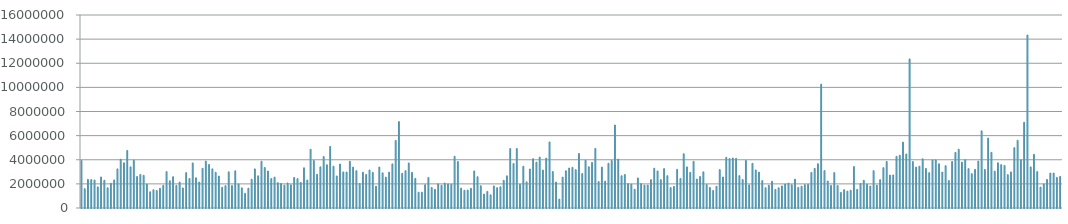
| Category | Series 0 |
|---|---|
| 0 | 3946390 |
| 01/01/1900 | 1602753 |
| 01/02/1900 | 2372721 |
| 01/03/1900 | 2360665 |
| 01/04/1900 | 2323856 |
| 01/05/1900 | 1751130 |
| 01/06/1900 | 2575121 |
| 01/07/1900 | 2301383 |
| 01/08/1900 | 1680497 |
| 01/09/1900 | 2054930 |
| 01/10/1900 | 2327089 |
| 01/11/1900 | 3243315 |
| 01/12/1900 | 4046918 |
| 01/13/1900 | 3746112 |
| 01/14/1900 | 4773891 |
| 01/15/1900 | 3409331 |
| 01/16/1900 | 3963879 |
| 01/17/1900 | 2609657 |
| 01/18/1900 | 2777923 |
| 01/19/1900 | 2710483 |
| 01/20/1900 | 1981261 |
| 01/21/1900 | 1346223 |
| 01/22/1900 | 1518529 |
| 01/23/1900 | 1452392 |
| 01/24/1900 | 1635826 |
| 01/25/1900 | 1880829 |
| 01/26/1900 | 3018823 |
| 01/27/1900 | 2259015 |
| 01/28/1900 | 2593445 |
| 01/29/1900 | 1875049 |
| 01/30/1900 | 2145251 |
| 01/31/1900 | 1665541 |
| 02/01/1900 | 2929063 |
| 02/02/1900 | 2443271 |
| 02/03/1900 | 3735485 |
| 02/04/1900 | 2502356 |
| 02/05/1900 | 2152778 |
| 02/06/1900 | 3288441 |
| 02/07/1900 | 3891859 |
| 02/08/1900 | 3602655 |
| 02/09/1900 | 3246615 |
| 02/10/1900 | 2961129 |
| 02/11/1900 | 2651836 |
| 02/12/1900 | 1719192 |
| 02/13/1900 | 1852563 |
| 02/14/1900 | 2996070 |
| 02/15/1900 | 1856852 |
| 02/16/1900 | 3083887 |
| 02/17/1900 | 1993288 |
| 02/18/1900 | 1673530 |
| 02/19/1900 | 1217043 |
| 02/20/1900 | 1644556 |
| 02/21/1900 | 2386463 |
| 02/22/1900 | 3242017 |
| 02/23/1900 | 2667200 |
| 02/24/1900 | 3876495 |
| 02/25/1900 | 3361025 |
| 02/26/1900 | 3067275 |
| 02/27/1900 | 2445652 |
| 02/28/1900 | 2561247 |
| 02/28/1900 | 2099490 |
| 03/01/1900 | 2030398 |
| 03/02/1900 | 1890686 |
| 03/03/1900 | 2076526 |
| 03/04/1900 | 1922738 |
| 03/05/1900 | 2536089 |
| 03/06/1900 | 2433474 |
| 03/07/1900 | 2120709 |
| 03/08/1900 | 3332353 |
| 03/09/1900 | 2321124 |
| 03/10/1900 | 4871186 |
| 03/11/1900 | 3933178 |
| 03/12/1900 | 2791394 |
| 03/13/1900 | 3413762 |
| 03/14/1900 | 4264014 |
| 03/15/1900 | 3584536 |
| 03/16/1900 | 5102383 |
| 03/17/1900 | 3465894 |
| 03/18/1900 | 2656096 |
| 03/19/1900 | 3646305 |
| 03/20/1900 | 2992025 |
| 03/21/1900 | 2981630 |
| 03/22/1900 | 3869230 |
| 03/23/1900 | 3392352 |
| 03/24/1900 | 3092191 |
| 03/25/1900 | 2026310 |
| 03/26/1900 | 2973783 |
| 03/27/1900 | 2784472 |
| 03/28/1900 | 3150487 |
| 03/29/1900 | 2962911 |
| 03/30/1900 | 1809433 |
| 03/31/1900 | 3397366 |
| 04/01/1900 | 2914943 |
| 04/02/1900 | 2558596 |
| 04/03/1900 | 2975157 |
| 04/04/1900 | 3657180 |
| 04/05/1900 | 5603496 |
| 04/06/1900 | 7162773 |
| 04/07/1900 | 2879846 |
| 04/08/1900 | 3092586 |
| 04/09/1900 | 3733279 |
| 04/10/1900 | 2952113 |
| 04/11/1900 | 2458370 |
| 04/12/1900 | 1309474 |
| 04/13/1900 | 1309195 |
| 04/14/1900 | 1927582 |
| 04/15/1900 | 2531883 |
| 04/16/1900 | 1701609 |
| 04/17/1900 | 1545761 |
| 04/18/1900 | 2001840 |
| 04/19/1900 | 1887362 |
| 04/20/1900 | 2072860 |
| 04/21/1900 | 1998509 |
| 04/22/1900 | 1963286 |
| 04/23/1900 | 4289626 |
| 04/24/1900 | 3852066 |
| 04/25/1900 | 1647109 |
| 04/26/1900 | 1472093 |
| 04/27/1900 | 1490113 |
| 04/28/1900 | 1636823 |
| 04/29/1900 | 3074938 |
| 04/30/1900 | 2595463 |
| 05/01/1900 | 1844386 |
| 05/02/1900 | 1156580 |
| 05/03/1900 | 1375456 |
| 05/04/1900 | 1092987 |
| 05/05/1900 | 1830897 |
| 05/06/1900 | 1682319 |
| 05/07/1900 | 1759955 |
| 05/08/1900 | 2291374 |
| 05/09/1900 | 2667354 |
| 05/10/1900 | 4929146 |
| 05/11/1900 | 3688645 |
| 05/12/1900 | 4929257 |
| 05/13/1900 | 1970952 |
| 05/14/1900 | 3461209 |
| 05/15/1900 | 2170533 |
| 05/16/1900 | 3234279 |
| 05/17/1900 | 4086555 |
| 05/18/1900 | 3809107 |
| 05/19/1900 | 4219627 |
| 05/20/1900 | 3148203 |
| 05/21/1900 | 4136041 |
| 05/22/1900 | 5473641 |
| 05/23/1900 | 3023153 |
| 05/24/1900 | 2151256 |
| 05/25/1900 | 735481 |
| 05/26/1900 | 2560124 |
| 05/27/1900 | 3086697 |
| 05/28/1900 | 3315666 |
| 05/29/1900 | 3369269 |
| 05/30/1900 | 3179477 |
| 05/31/1900 | 4521838 |
| 06/01/1900 | 2855696 |
| 06/02/1900 | 3968830 |
| 06/03/1900 | 3415741 |
| 06/04/1900 | 3780301 |
| 06/05/1900 | 4936999 |
| 06/06/1900 | 2192259 |
| 06/07/1900 | 3395791 |
| 06/08/1900 | 2230413 |
| 06/09/1900 | 3707295 |
| 06/10/1900 | 3936775 |
| 06/11/1900 | 6879725 |
| 06/12/1900 | 4055015 |
| 06/13/1900 | 2674575 |
| 06/14/1900 | 2777780 |
| 06/15/1900 | 2019285 |
| 06/16/1900 | 1972120 |
| 06/17/1900 | 1552570 |
| 06/18/1900 | 2494635 |
| 06/19/1900 | 2025705 |
| 06/20/1900 | 1898985 |
| 06/21/1900 | 1899055 |
| 06/22/1900 | 2352105 |
| 06/23/1900 | 3297085 |
| 06/24/1900 | 3073060 |
| 06/25/1900 | 2351210 |
| 06/26/1900 | 3266390 |
| 06/27/1900 | 2680090 |
| 06/28/1900 | 1694810 |
| 06/29/1900 | 1793760 |
| 06/30/1900 | 3207710 |
| 07/01/1900 | 2449245 |
| 07/02/1900 | 4497090 |
| 07/03/1900 | 3410605 |
| 07/04/1900 | 2953725 |
| 07/05/1900 | 3870825 |
| 07/06/1900 | 2403105 |
| 07/07/1900 | 2608240 |
| 07/08/1900 | 2997735 |
| 07/09/1900 | 1952065 |
| 07/10/1900 | 1707070 |
| 07/11/1900 | 1459140 |
| 07/12/1900 | 1802960 |
| 07/13/1900 | 3187130 |
| 07/14/1900 | 2574015 |
| 07/15/1900 | 4206200 |
| 07/16/1900 | 4094925 |
| 07/17/1900 | 4145260 |
| 07/18/1900 | 4113700 |
| 07/19/1900 | 2682860 |
| 07/20/1900 | 2363815 |
| 07/21/1900 | 3947770 |
| 07/22/1900 | 1920840 |
| 07/23/1900 | 3703655 |
| 07/24/1900 | 3155815 |
| 07/25/1900 | 2975195 |
| 07/26/1900 | 2274290 |
| 07/27/1900 | 1678040 |
| 07/28/1900 | 1891100 |
| 07/29/1900 | 2213810 |
| 07/30/1900 | 1542150 |
| 07/31/1900 | 1675960 |
| 08/01/1900 | 1828335 |
| 08/02/1900 | 1989090 |
| 08/03/1900 | 2057650 |
| 08/04/1900 | 1932345 |
| 08/05/1900 | 2393630 |
| 08/06/1900 | 1717190 |
| 08/07/1900 | 1798230 |
| 08/08/1900 | 1937200 |
| 08/09/1900 | 1960025 |
| 08/10/1900 | 2953070 |
| 08/11/1900 | 3286680 |
| 08/12/1900 | 3667720 |
| 08/13/1900 | 10269435 |
| 08/14/1900 | 3098725 |
| 08/15/1900 | 2237030 |
| 08/16/1900 | 1873575 |
| 08/17/1900 | 2935805 |
| 08/18/1900 | 1866540 |
| 08/19/1900 | 1285935 |
| 08/20/1900 | 1520320 |
| 08/21/1900 | 1402055 |
| 08/22/1900 | 1479755 |
| 08/23/1900 | 3431955 |
| 08/24/1900 | 1545140 |
| 08/25/1900 | 2019875 |
| 08/26/1900 | 2297370 |
| 08/27/1900 | 1977915 |
| 08/28/1900 | 1821450 |
| 08/29/1900 | 3095475 |
| 08/30/1900 | 1897390 |
| 08/31/1900 | 2346395 |
| 09/01/1900 | 3344590 |
| 09/02/1900 | 3859160 |
| 09/03/1900 | 2731475 |
| 09/04/1900 | 2740430 |
| 09/05/1900 | 4279825 |
| 09/06/1900 | 4377025 |
| 09/07/1900 | 5460390 |
| 09/08/1900 | 4479215 |
| 09/09/1900 | 12361620 |
| 09/10/1900 | 3844685 |
| 09/11/1900 | 3392450 |
| 09/12/1900 | 3463780 |
| 09/13/1900 | 4078385 |
| 09/14/1900 | 3280725 |
| 09/15/1900 | 2927065 |
| 09/16/1900 | 3974725 |
| 09/17/1900 | 3986665 |
| 09/18/1900 | 3665735 |
| 09/19/1900 | 2980315 |
| 09/20/1900 | 3510635 |
| 09/21/1900 | 2272570 |
| 09/22/1900 | 3856050 |
| 09/23/1900 | 4610010 |
| 09/24/1900 | 4876045 |
| 09/25/1900 | 3801465 |
| 09/26/1900 | 3999590 |
| 09/27/1900 | 3266320 |
| 09/28/1900 | 2844800 |
| 09/29/1900 | 3203360 |
| 09/30/1900 | 3890730 |
| 10/01/1900 | 6396455 |
| 10/02/1900 | 3199455 |
| 10/03/1900 | 5795945 |
| 10/04/1900 | 4613685 |
| 10/05/1900 | 3055180 |
| 10/06/1900 | 3748580 |
| 10/07/1900 | 3592380 |
| 10/08/1900 | 3527970 |
| 10/09/1900 | 2766805 |
| 10/10/1900 | 2994175 |
| 10/11/1900 | 5001320 |
| 10/12/1900 | 5617130 |
| 10/13/1900 | 3986600 |
| 10/14/1900 | 7107010 |
| 10/15/1900 | 14339095 |
| 10/16/1900 | 3408040 |
| 10/17/1900 | 4452330 |
| 10/18/1900 | 3020515 |
| 10/19/1900 | 1737835 |
| 10/20/1900 | 1999990 |
| 10/21/1900 | 2367775 |
| 10/22/1900 | 2897060 |
| 10/23/1900 | 2897900 |
| 10/24/1900 | 2532455 |
| 10/25/1900 | 2620020 |